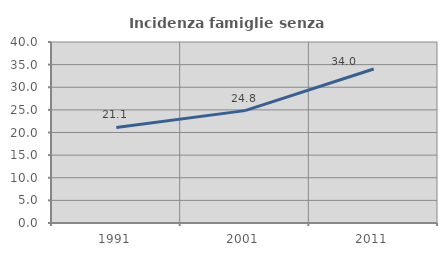
| Category | Incidenza famiglie senza nuclei |
|---|---|
| 1991.0 | 21.127 |
| 2001.0 | 24.834 |
| 2011.0 | 34.044 |